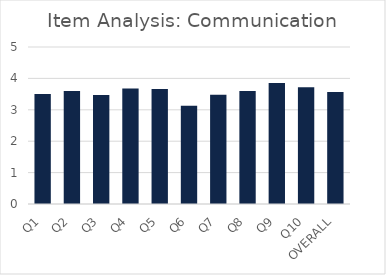
| Category | Series 0 |
|---|---|
| Q1 | 3.5 |
| Q2 | 3.6 |
| Q3 | 3.47 |
| Q4 | 3.68 |
| Q5 | 3.66 |
| Q6 | 3.13 |
| Q7 | 3.48 |
| Q8 | 3.6 |
| Q9 | 3.85 |
| Q10 | 3.72 |
| OVERALL | 3.57 |